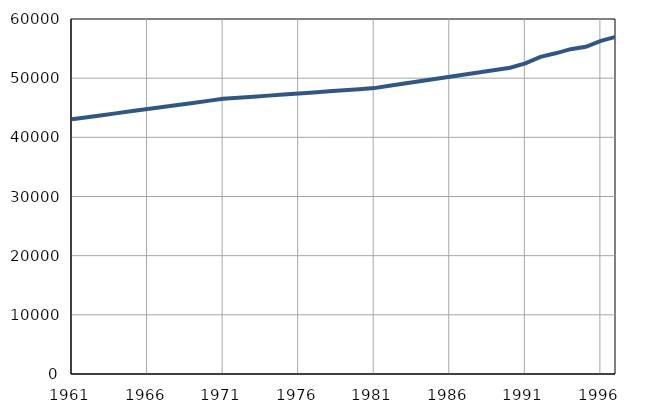
| Category | Број
становника |
|---|---|
| 1961.0 | 43058 |
| 1962.0 | 43403 |
| 1963.0 | 43748 |
| 1964.0 | 44093 |
| 1965.0 | 44438 |
| 1966.0 | 44783 |
| 1967.0 | 45128 |
| 1968.0 | 45473 |
| 1969.0 | 45818 |
| 1970.0 | 46163 |
| 1971.0 | 46504 |
| 1972.0 | 46686 |
| 1973.0 | 46868 |
| 1974.0 | 47050 |
| 1975.0 | 47232 |
| 1976.0 | 47414 |
| 1977.0 | 47596 |
| 1978.0 | 47778 |
| 1979.0 | 47960 |
| 1980.0 | 48142 |
| 1981.0 | 48320 |
| 1982.0 | 48703 |
| 1983.0 | 49086 |
| 1984.0 | 49469 |
| 1985.0 | 49852 |
| 1986.0 | 50235 |
| 1987.0 | 50618 |
| 1988.0 | 51001 |
| 1989.0 | 51384 |
| 1990.0 | 51767 |
| 1991.0 | 52500 |
| 1992.0 | 53600 |
| 1993.0 | 54200 |
| 1994.0 | 54900 |
| 1995.0 | 55300 |
| 1996.0 | 56300 |
| 1997.0 | 57000 |